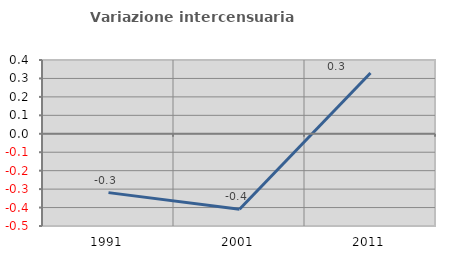
| Category | Variazione intercensuaria annua |
|---|---|
| 1991.0 | -0.319 |
| 2001.0 | -0.409 |
| 2011.0 | 0.329 |